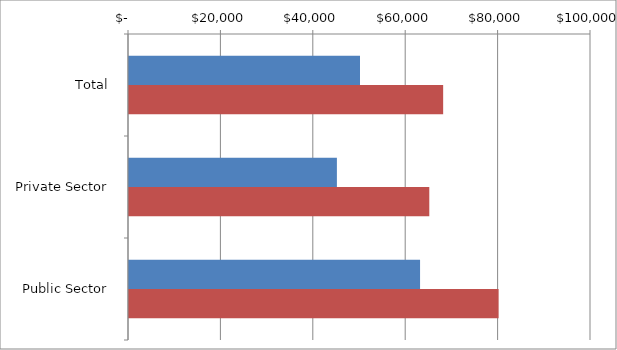
| Category | Series 0 | Series 1 |
|---|---|---|
| Total | 50000 | 68000 |
|  Private Sector  | 45000 | 65000 |
|  Public Sector  | 63000 | 80000 |